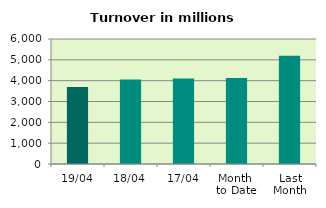
| Category | Series 0 |
|---|---|
| 19/04 | 3701.222 |
| 18/04 | 4052.683 |
| 17/04 | 4108.07 |
| Month 
to Date | 4123.331 |
| Last
Month | 5192.573 |